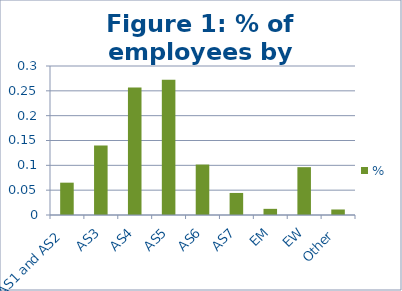
| Category | % |
|---|---|
| AS1 and AS2 | 0.065 |
| AS3 | 0.14 |
| AS4 | 0.257 |
| AS5 | 0.272 |
| AS6 | 0.102 |
| AS7 | 0.044 |
| EM | 0.012 |
| EW | 0.096 |
| Other | 0.011 |